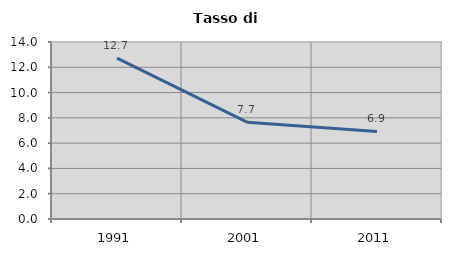
| Category | Tasso di disoccupazione   |
|---|---|
| 1991.0 | 12.727 |
| 2001.0 | 7.658 |
| 2011.0 | 6.926 |